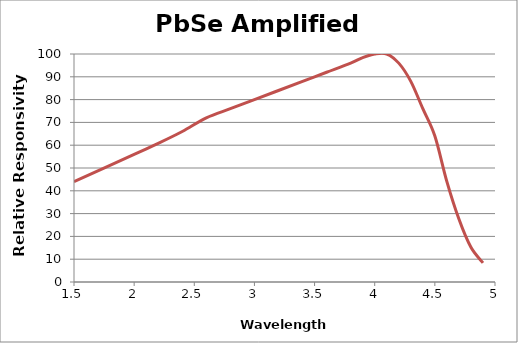
| Category | PDA20H |
|---|---|
| 1.5 | 44 |
| 2.0 | 56 |
| 2.2 | 60.8 |
| 2.4 | 66 |
| 2.6 | 72 |
| 2.8 | 76 |
| 3.0 | 80 |
| 3.2 | 84 |
| 3.4 | 88 |
| 3.6 | 92 |
| 3.8 | 96 |
| 3.9 | 98.4 |
| 4.0 | 100 |
| 4.1 | 100 |
| 4.2 | 96 |
| 4.3 | 88 |
| 4.4 | 76 |
| 4.5 | 64 |
| 4.6 | 44 |
| 4.7 | 27.6 |
| 4.8 | 15.2 |
| 4.9 | 8.4 |